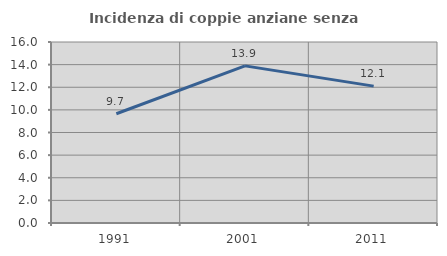
| Category | Incidenza di coppie anziane senza figli  |
|---|---|
| 1991.0 | 9.659 |
| 2001.0 | 13.889 |
| 2011.0 | 12.099 |